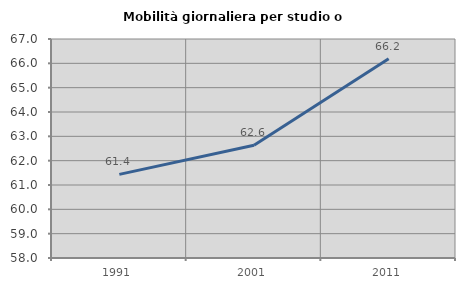
| Category | Mobilità giornaliera per studio o lavoro |
|---|---|
| 1991.0 | 61.438 |
| 2001.0 | 62.631 |
| 2011.0 | 66.184 |